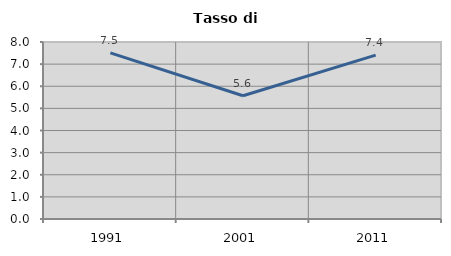
| Category | Tasso di disoccupazione   |
|---|---|
| 1991.0 | 7.511 |
| 2001.0 | 5.57 |
| 2011.0 | 7.407 |